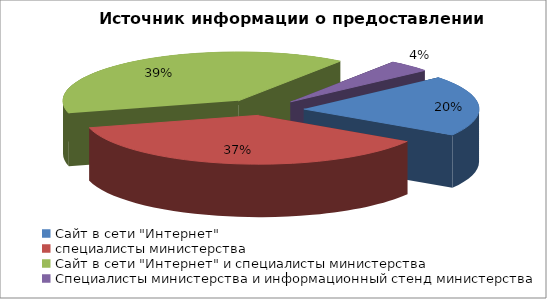
| Category | Источник информации о предоставлении услуг |
|---|---|
| Сайт в сети "Интернет"  | 0.2 |
| специалисты министерства | 0.37 |
| Сайт в сети "Интернет" и специалисты министерства | 0.39 |
| Специалисты министерства и информационный стенд министерства | 0.04 |